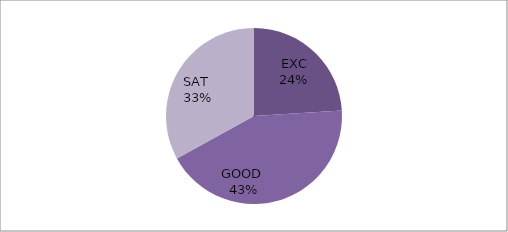
| Category | Series 0 |
|---|---|
| EXC | 24 |
| GOOD  | 43 |
| SAT  | 33 |